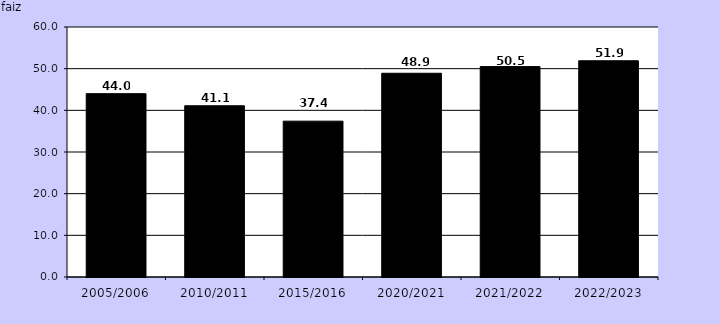
| Category | Series 1 |
|---|---|
| 2005/2006 | 44 |
| 2010/2011 | 41.1 |
| 2015/2016 | 37.4 |
| 2020/2021 | 48.9 |
| 2021/2022 | 50.5 |
| 2022/2023 | 51.9 |